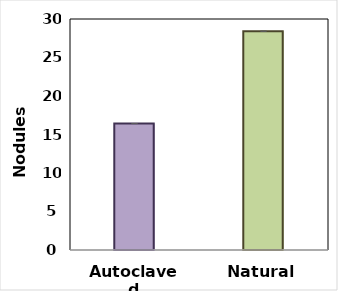
| Category | Nodules |
|---|---|
| Autoclaved | 16.423 |
| Natural | 28.412 |